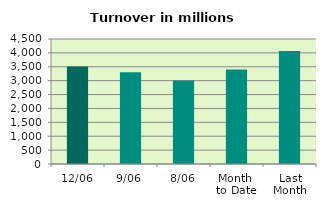
| Category | Series 0 |
|---|---|
| 12/06 | 3509.547 |
| 9/06 | 3299.192 |
| 8/06 | 3001.917 |
| Month 
to Date | 3400.798 |
| Last
Month | 4067.502 |